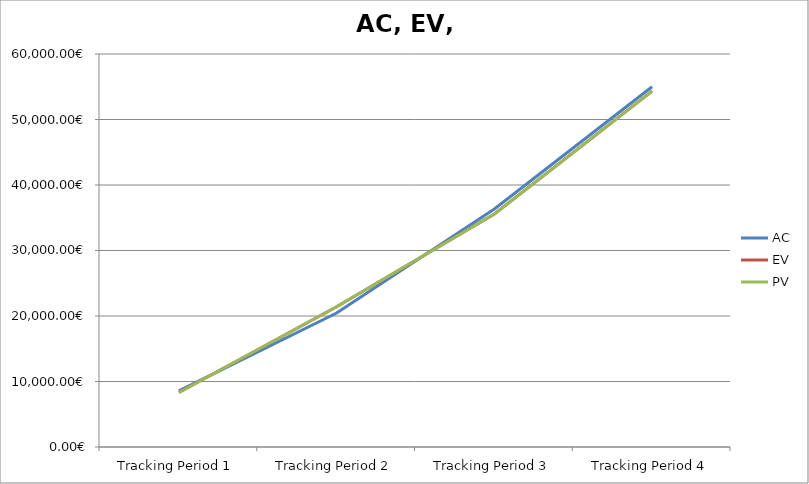
| Category | AC | EV | PV |
|---|---|---|---|
| Tracking Period 1 | 8570.57 | 8318.57 | 8318.57 |
| Tracking Period 2 | 20452.8 | 21416.8 | 21416.8 |
| Tracking Period 3 | 36327.59 | 35564.59 | 35564.59 |
| Tracking Period 4 | 54996.22 | 54324.22 | 54324.22 |